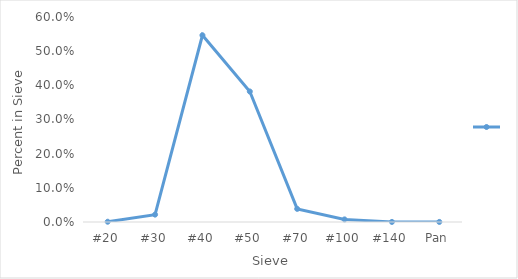
| Category | Series 0 |
|---|---|
| #20 | 0.001 |
| #30 | 0.022 |
| #40 | 0.547 |
| #50 | 0.382 |
| #70 | 0.038 |
| #100 | 0.008 |
| #140 | 0 |
| Pan | 0 |